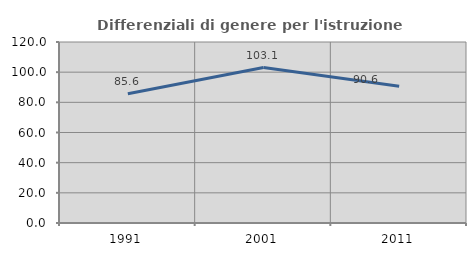
| Category | Differenziali di genere per l'istruzione superiore |
|---|---|
| 1991.0 | 85.633 |
| 2001.0 | 103.092 |
| 2011.0 | 90.609 |